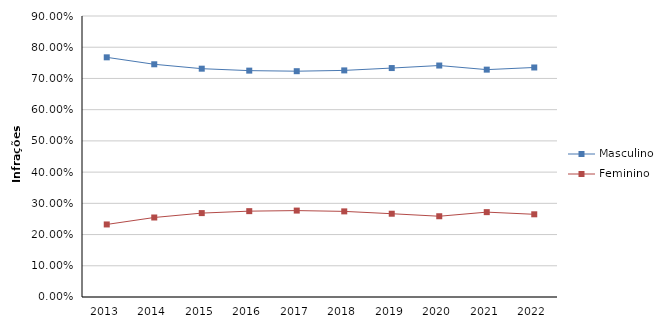
| Category | Masculino | Feminino |
|---|---|---|
| 2013 | 0.768 | 0.232 |
| 2014 | 0.745 | 0.255 |
| 2015 | 0.731 | 0.269 |
| 2016 | 0.725 | 0.275 |
| 2017 | 0.723 | 0.277 |
| 2018 | 0.726 | 0.274 |
| 2019 | 0.733 | 0.267 |
| 2020 | 0.741 | 0.259 |
| 2021 | 0.728 | 0.272 |
| 2022 | 0.735 | 0.265 |